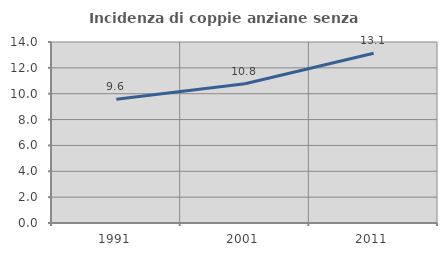
| Category | Incidenza di coppie anziane senza figli  |
|---|---|
| 1991.0 | 9.565 |
| 2001.0 | 10.776 |
| 2011.0 | 13.136 |